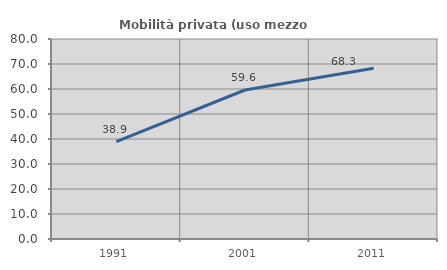
| Category | Mobilità privata (uso mezzo privato) |
|---|---|
| 1991.0 | 38.931 |
| 2001.0 | 59.599 |
| 2011.0 | 68.312 |